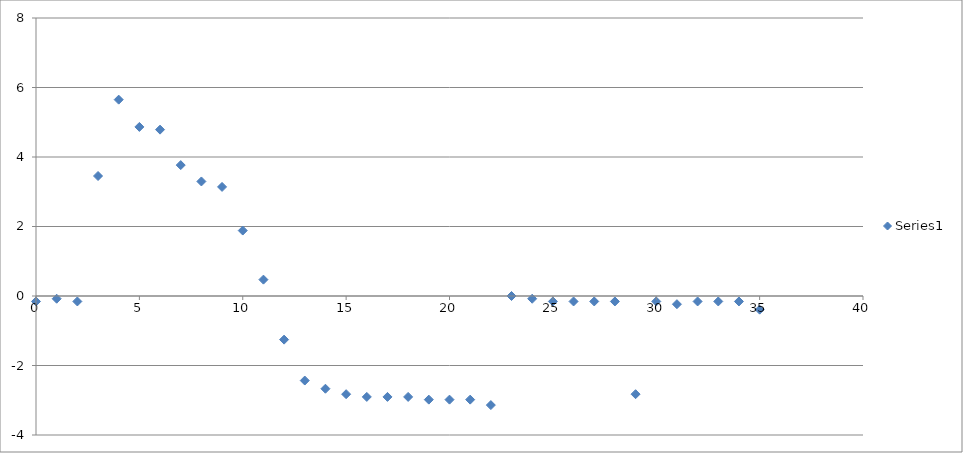
| Category | Series 0 |
|---|---|
| 0.0 | -0.157 |
| 1.0 | -0.078 |
| 2.0 | -0.157 |
| 3.0 | 3.453 |
| 4.0 | 5.651 |
| 5.0 | 4.866 |
| 6.0 | 4.787 |
| 7.0 | 3.767 |
| 8.0 | 3.296 |
| 9.0 | 3.139 |
| 10.0 | 1.884 |
| 11.0 | 0.471 |
| 12.0 | -1.256 |
| 13.0 | -2.433 |
| 14.0 | -2.668 |
| 15.0 | -2.825 |
| 16.0 | -2.904 |
| 17.0 | -2.904 |
| 18.0 | -2.904 |
| 19.0 | -2.982 |
| 20.0 | -2.982 |
| 21.0 | -2.982 |
| 22.0 | -3.139 |
| 23.0 | 0 |
| 24.0 | -0.078 |
| 25.0 | -0.157 |
| 26.0 | -0.157 |
| 27.0 | -0.157 |
| 28.0 | -0.157 |
| 29.0 | -2.825 |
| 30.0 | -0.157 |
| 31.0 | -0.235 |
| 32.0 | -0.157 |
| 33.0 | -0.157 |
| 34.0 | -0.157 |
| 35.0 | -0.392 |